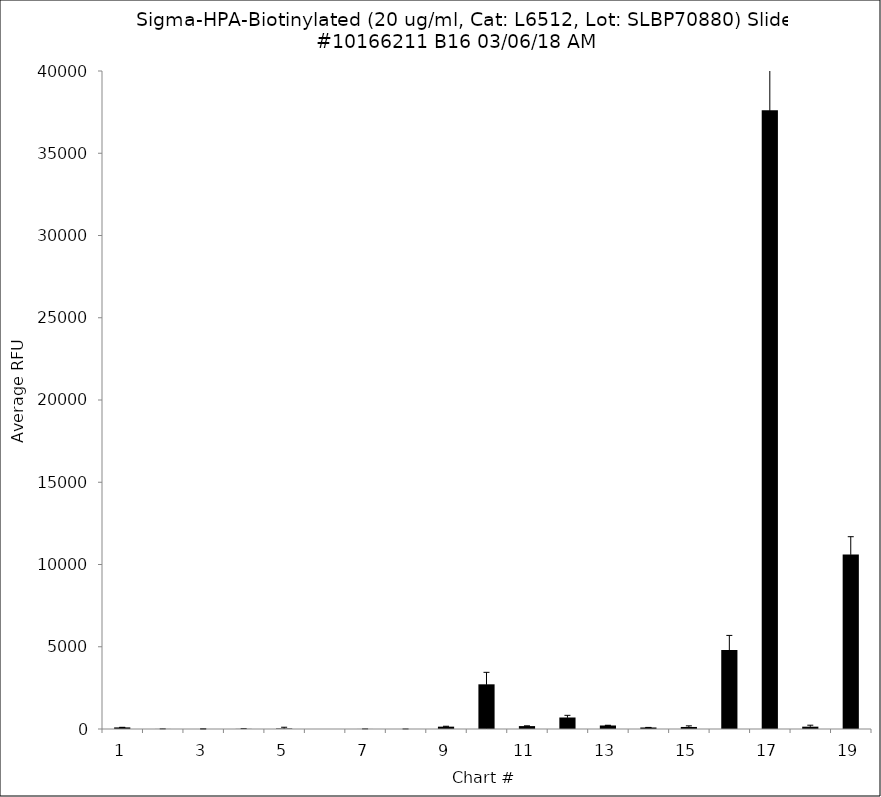
| Category | Series 0 |
|---|---|
| 1.0 | 96.75 |
| 2.0 | 3.75 |
| 3.0 | -0.25 |
| 4.0 | 7.75 |
| 5.0 | 30.75 |
| 6.0 | -5.25 |
| 7.0 | 2.5 |
| 8.0 | 0.5 |
| 9.0 | 142.75 |
| 10.0 | 2716.25 |
| 11.0 | 177 |
| 12.0 | 699 |
| 13.0 | 213.5 |
| 14.0 | 92 |
| 15.0 | 124.25 |
| 16.0 | 4800 |
| 17.0 | 37612 |
| 18.0 | 141.5 |
| 19.0 | 10614.25 |